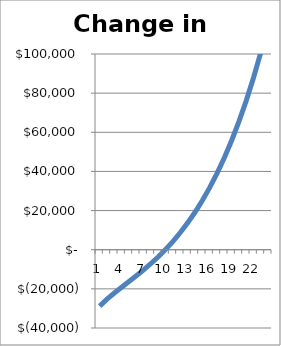
| Category | Change in Cash |
|---|---|
| 0 | -28800 |
| 1 | -25261.5 |
| 2 | -22108.619 |
| 3 | -19152.328 |
| 4 | -16258.028 |
| 5 | -13325.505 |
| 6 | -10276.273 |
| 7 | -7045.418 |
| 8 | -3576.211 |
| 9 | 183.527 |
| 10 | 4283.961 |
| 11 | 8775.065 |
| 12 | 13707.985 |
| 13 | 19136.111 |
| 14 | 25115.955 |
| 15 | 31707.912 |
| 16 | 38976.952 |
| 17 | 46993.271 |
| 18 | 55832.935 |
| 19 | 65578.522 |
| 20 | 76319.789 |
| 21 | 88154.359 |
| 22 | 101188.454 |
| 23 | 115537.666 |